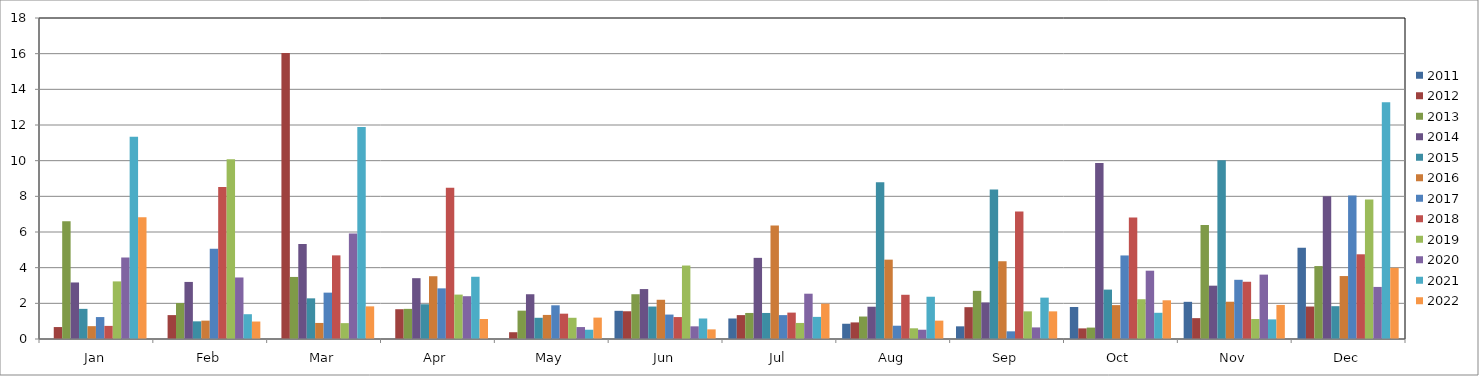
| Category | 2011 | 2012 | 2013 | 2014 | 2015 | 2016 | 2017 | 2018 | 2019 | 2020 | 2021 | 2022 |
|---|---|---|---|---|---|---|---|---|---|---|---|---|
| Jan | 0 | 0.67 | 6.6 | 3.17 | 1.69 | 0.72 | 1.23 | 0.735 | 3.23 | 4.57 | 11.34 | 6.83 |
| Feb | 0 | 1.34 | 2.02 | 3.2 | 0.99 | 1.03 | 5.06 | 8.525 | 10.08 | 3.45 | 1.39 | 0.98 |
| Mar | 0 | 16.04 | 3.48 | 5.33 | 2.28 | 0.9 | 2.6 | 4.69 | 0.89 | 5.92 | 11.89 | 1.83 |
| Apr | 0 | 1.67 | 1.69 | 3.41 | 1.95 | 3.52 | 2.84 | 8.48 | 2.49 | 2.4 | 3.49 | 1.12 |
| May | 0 | 0.38 | 1.59 | 2.51 | 1.19 | 1.35 | 1.89 | 1.42 | 1.19 | 0.67 | 0.52 | 1.2 |
| Jun | 1.58 | 1.555 | 2.51 | 2.8 | 1.82 | 2.2 | 1.37 | 1.23 | 4.12 | 0.71 | 1.15 | 0.54 |
| Jul | 1.15 | 1.34 | 1.46 | 4.55 | 1.46 | 6.37 | 1.34 | 1.48 | 0.9 | 2.54 | 1.24 | 1.98 |
| Aug | 0.855 | 0.93 | 1.26 | 1.81 | 8.79 | 4.45 | 0.745 | 2.48 | 0.6 | 0.52 | 2.37 | 1.03 |
| Sep | 0.71 | 1.785 | 2.7 | 2.05 | 8.39 | 4.36 | 0.43 | 7.15 | 1.55 | 0.65 | 2.32 | 1.55 |
| Oct | 1.795 | 0.595 | 0.64 | 9.87 | 2.77 | 1.9 | 4.685 | 6.82 | 2.23 | 3.83 | 1.47 | 2.17 |
| Nov | 2.085 | 1.17 | 6.39 | 2.99 | 10.03 | 2.09 | 3.32 | 3.21 | 1.12 | 3.61 | 1.1 | 1.91 |
| Dec | 5.11 | 1.82 | 4.09 | 8 | 1.84 | 3.53 | 8.04 | 4.75 | 7.82 | 2.92 | 13.27 | 3.99 |